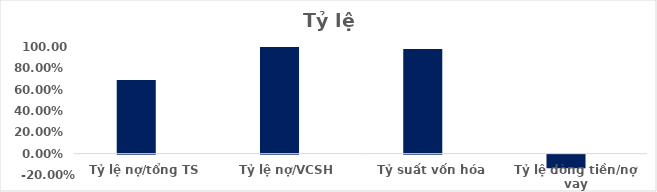
| Category | Series 0 | Series 1 | Series 2 | Series 3 | Series 4 | Series 5 | Series 6 |
|---|---|---|---|---|---|---|---|
| Tỷ lệ nợ/tổng TS | 0.69 |  |  |  |  |  |  |
| Tỷ lệ nợ/VCSH | 2.228 |  |  |  |  |  |  |
| Tỷ suất vốn hóa | 0.982 |  |  |  |  |  |  |
| Tỷ lệ dòng tiền/nợ vay | -0.127 |  |  |  |  |  |  |